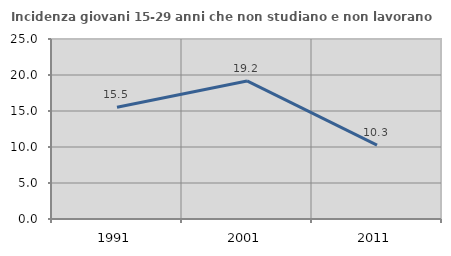
| Category | Incidenza giovani 15-29 anni che non studiano e non lavorano  |
|---|---|
| 1991.0 | 15.524 |
| 2001.0 | 19.178 |
| 2011.0 | 10.256 |